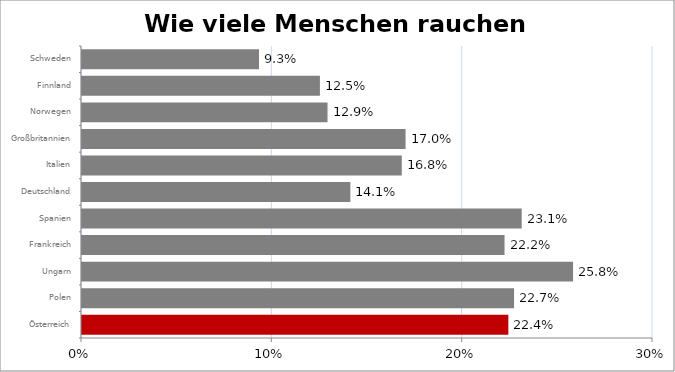
| Category | %-Anteil |
|---|---|
| Österreich | 0.224 |
| Polen | 0.227 |
| Ungarn | 0.258 |
| Frankreich | 0.222 |
| Spanien | 0.231 |
| Deutschland | 0.141 |
| Italien | 0.168 |
| Großbritannien | 0.17 |
| Norwegen | 0.129 |
| Finnland | 0.125 |
| Schweden | 0.093 |